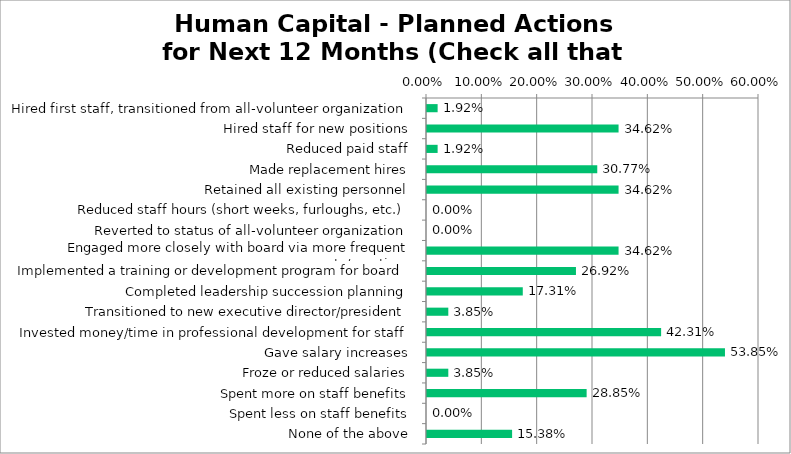
| Category | Responses |
|---|---|
| Hired first staff, transitioned from all-volunteer organization | 0.019 |
| Hired staff for new positions | 0.346 |
| Reduced paid staff | 0.019 |
| Made replacement hires | 0.308 |
| Retained all existing personnel | 0.346 |
| Reduced staff hours (short weeks, furloughs, etc.) | 0 |
| Reverted to status of all-volunteer organization | 0 |
| Engaged more closely with board via more frequent reports/meetings | 0.346 |
| Implemented a training or development program for board | 0.269 |
| Completed leadership succession planning | 0.173 |
| Transitioned to new executive director/president | 0.038 |
| Invested money/time in professional development for staff | 0.423 |
| Gave salary increases | 0.538 |
| Froze or reduced salaries | 0.038 |
| Spent more on staff benefits | 0.288 |
| Spent less on staff benefits | 0 |
| None of the above | 0.154 |